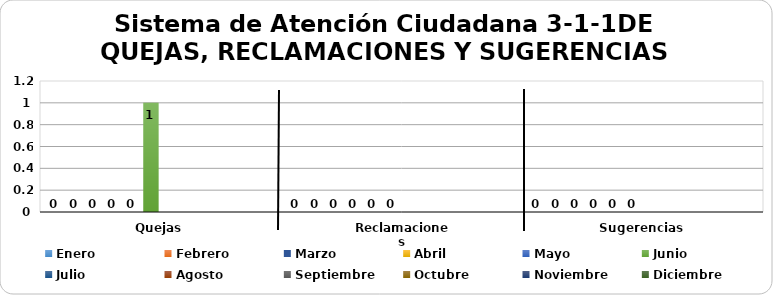
| Category | Enero | Febrero | Marzo | Abril | Mayo | Junio | Julio | Agosto | Septiembre | Octubre | Noviembre | Diciembre |
|---|---|---|---|---|---|---|---|---|---|---|---|---|
| Quejas | 0 | 0 | 0 | 0 | 0 | 1 |  |  |  |  |  |  |
| Reclamaciones | 0 | 0 | 0 | 0 | 0 | 0 |  |  |  |  |  |  |
| Sugerencias | 0 | 0 | 0 | 0 | 0 | 0 |  |  |  |  |  |  |